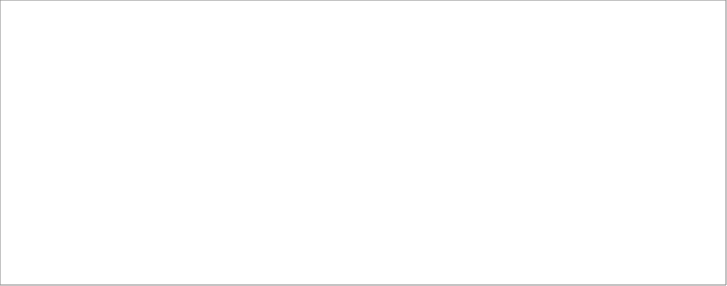
| Category | % |
|---|---|
| Нагрузочные 59% | 59 |
| Погр учета | 2 |
| ХХ тр-ра | 35 |
| Прочие | 4 |